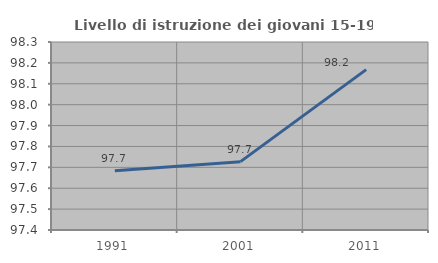
| Category | Livello di istruzione dei giovani 15-19 anni |
|---|---|
| 1991.0 | 97.684 |
| 2001.0 | 97.727 |
| 2011.0 | 98.168 |